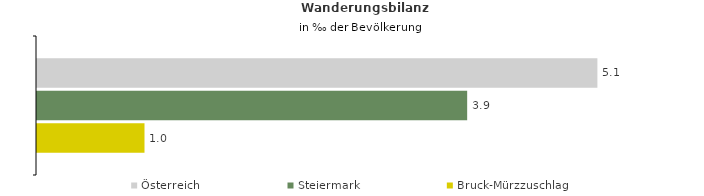
| Category | Österreich | Steiermark | Bruck-Mürzzuschlag |
|---|---|---|---|
| Wanderungsrate in ‰ der Bevölkerung, Periode 2016-2020 | 5.087 | 3.905 | 0.976 |